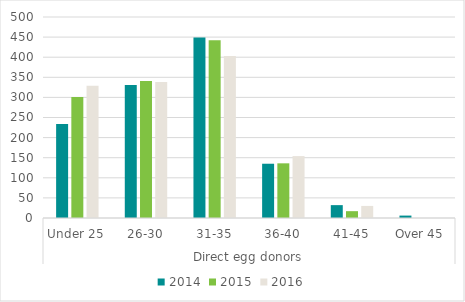
| Category | 2014 | 2015 | 2016 |
|---|---|---|---|
| 0 | 234 | 301 | 329 |
| 1 | 331 | 341 | 338 |
| 2 | 449 | 442 | 403 |
| 3 | 135 | 136 | 154 |
| 4 | 32 | 17 | 30 |
| 5 | 6 | 0 | 0 |